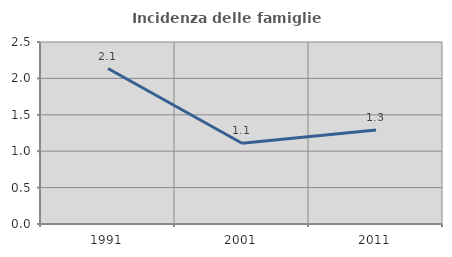
| Category | Incidenza delle famiglie numerose |
|---|---|
| 1991.0 | 2.135 |
| 2001.0 | 1.109 |
| 2011.0 | 1.292 |